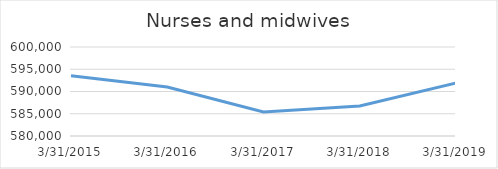
| Category | Nurses and midwives |
|---|---|
| 3/31/15 | 593548 |
| 3/31/16 | 590991 |
| 3/31/17 | 585404 |
| 3/31/18 | 586725 |
| 3/31/19 | 591894 |